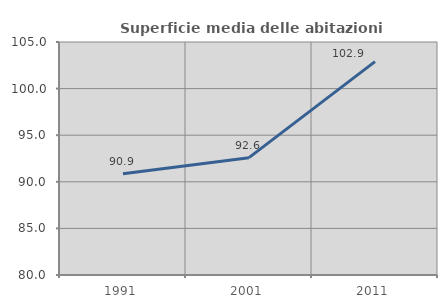
| Category | Superficie media delle abitazioni occupate |
|---|---|
| 1991.0 | 90.858 |
| 2001.0 | 92.591 |
| 2011.0 | 102.897 |